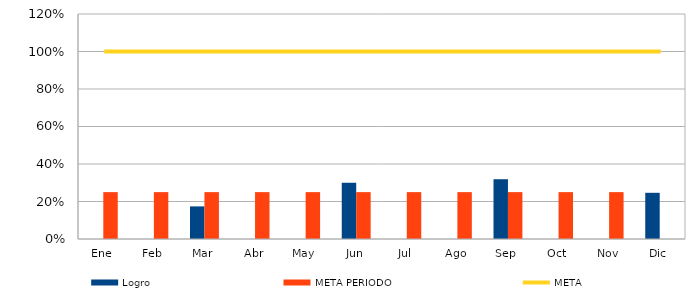
| Category | Logro  | META PERIODO |
|---|---|---|
| Ene | 0 | 0.25 |
| Feb | 0 | 0.25 |
| Mar | 0.174 | 0.25 |
| Abr | 0 | 0.25 |
| May | 0 | 0.25 |
| Jun | 0.3 | 0.25 |
| Jul | 0 | 0.25 |
| Ago | 0 | 0.25 |
| Sep | 0.319 | 0.25 |
| Oct | 0 | 0.25 |
| Nov | 0 | 0.25 |
| Dic | 0.246 | 0 |